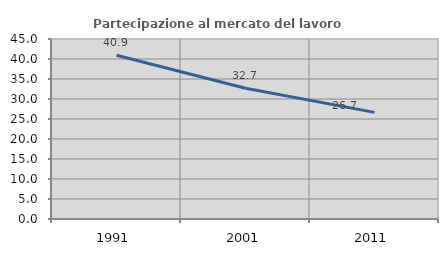
| Category | Partecipazione al mercato del lavoro  femminile |
|---|---|
| 1991.0 | 40.929 |
| 2001.0 | 32.673 |
| 2011.0 | 26.657 |